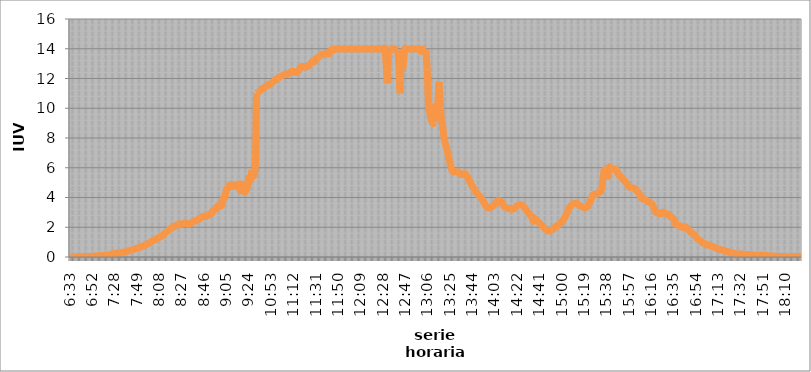
| Category | Series 0 |
|---|---|
| 0.27291666666666664 | 0.014 |
| 0.2736111111111111 | 0.014 |
| 0.2743055555555555 | 0.014 |
| 0.275 | 0.014 |
| 0.27569444444444446 | 0.014 |
| 0.27638888888888885 | 0.014 |
| 0.27708333333333335 | 0.014 |
| 0.2777777777777778 | 0.014 |
| 0.27847222222222223 | 0.014 |
| 0.2791666666666667 | 0.014 |
| 0.2798611111111111 | 0.014 |
| 0.28055555555555556 | 0.028 |
| 0.28125 | 0.028 |
| 0.28194444444444444 | 0.028 |
| 0.2826388888888889 | 0.028 |
| 0.2833333333333333 | 0.028 |
| 0.28402777777777777 | 0.028 |
| 0.2847222222222222 | 0.028 |
| 0.28541666666666665 | 0.028 |
| 0.28611111111111115 | 0.042 |
| 0.2923611111111111 | 0.056 |
| 0.29305555555555557 | 0.07 |
| 0.29375 | 0.07 |
| 0.29444444444444445 | 0.07 |
| 0.2951388888888889 | 0.07 |
| 0.29583333333333334 | 0.084 |
| 0.2972222222222222 | 0.084 |
| 0.29791666666666666 | 0.098 |
| 0.2986111111111111 | 0.098 |
| 0.29930555555555555 | 0.112 |
| 0.3 | 0.112 |
| 0.30069444444444443 | 0.112 |
| 0.3013888888888889 | 0.126 |
| 0.3020833333333333 | 0.126 |
| 0.30277777777777776 | 0.126 |
| 0.3090277777777778 | 0.21 |
| 0.30972222222222223 | 0.224 |
| 0.3104166666666667 | 0.224 |
| 0.3111111111111111 | 0.238 |
| 0.31180555555555556 | 0.252 |
| 0.3125 | 0.266 |
| 0.31319444444444444 | 0.266 |
| 0.3138888888888889 | 0.28 |
| 0.3145833333333333 | 0.294 |
| 0.31527777777777777 | 0.308 |
| 0.3159722222222222 | 0.322 |
| 0.31666666666666665 | 0.336 |
| 0.31736111111111115 | 0.35 |
| 0.31805555555555554 | 0.377 |
| 0.3201388888888889 | 0.419 |
| 0.32083333333333336 | 0.433 |
| 0.3215277777777778 | 0.447 |
| 0.32222222222222224 | 0.475 |
| 0.3229166666666667 | 0.503 |
| 0.3236111111111111 | 0.531 |
| 0.32430555555555557 | 0.559 |
| 0.325 | 0.587 |
| 0.32569444444444445 | 0.601 |
| 0.3263888888888889 | 0.629 |
| 0.32708333333333334 | 0.657 |
| 0.3277777777777778 | 0.685 |
| 0.3284722222222222 | 0.727 |
| 0.32916666666666666 | 0.755 |
| 0.3298611111111111 | 0.797 |
| 0.33055555555555555 | 0.825 |
| 0.33125 | 0.867 |
| 0.33194444444444443 | 0.909 |
| 0.3326388888888889 | 0.951 |
| 0.3333333333333333 | 0.993 |
| 0.3340277777777778 | 1.048 |
| 0.3347222222222222 | 1.09 |
| 0.3354166666666667 | 1.132 |
| 0.3361111111111111 | 1.174 |
| 0.3368055555555556 | 1.216 |
| 0.3375 | 1.258 |
| 0.33819444444444446 | 1.314 |
| 0.33888888888888885 | 1.356 |
| 0.33958333333333335 | 1.398 |
| 0.34027777777777773 | 1.44 |
| 0.34097222222222223 | 1.51 |
| 0.3416666666666666 | 1.594 |
| 0.3423611111111111 | 1.664 |
| 0.3430555555555555 | 1.734 |
| 0.34375 | 1.789 |
| 0.3444444444444445 | 1.859 |
| 0.3451388888888889 | 1.915 |
| 0.3458333333333334 | 1.957 |
| 0.34652777777777777 | 1.999 |
| 0.34722222222222227 | 2.027 |
| 0.34791666666666665 | 2.083 |
| 0.34861111111111115 | 2.139 |
| 0.34930555555555554 | 2.167 |
| 0.35 | 2.195 |
| 0.3506944444444444 | 2.237 |
| 0.3513888888888889 | 2.209 |
| 0.3520833333333333 | 2.209 |
| 0.3527777777777778 | 2.251 |
| 0.3534722222222222 | 2.293 |
| 0.3541666666666667 | 2.279 |
| 0.3548611111111111 | 2.223 |
| 0.35555555555555557 | 2.209 |
| 0.35625 | 2.223 |
| 0.35694444444444445 | 2.265 |
| 0.3576388888888889 | 2.335 |
| 0.35833333333333334 | 2.363 |
| 0.3590277777777778 | 2.405 |
| 0.3597222222222222 | 2.433 |
| 0.36041666666666666 | 2.433 |
| 0.3611111111111111 | 2.474 |
| 0.36180555555555555 | 2.572 |
| 0.3625 | 2.6 |
| 0.36319444444444443 | 2.67 |
| 0.3638888888888889 | 2.712 |
| 0.3645833333333333 | 2.754 |
| 0.3652777777777778 | 2.726 |
| 0.3659722222222222 | 2.726 |
| 0.3666666666666667 | 2.768 |
| 0.3673611111111111 | 2.824 |
| 0.3680555555555556 | 2.866 |
| 0.36875 | 2.894 |
| 0.36944444444444446 | 2.936 |
| 0.37013888888888885 | 3.118 |
| 0.37083333333333335 | 3.173 |
| 0.37152777777777773 | 3.215 |
| 0.37222222222222223 | 3.285 |
| 0.3729166666666666 | 3.425 |
| 0.3736111111111111 | 3.481 |
| 0.3743055555555555 | 3.411 |
| 0.375 | 3.453 |
| 0.3756944444444445 | 3.635 |
| 0.3763888888888889 | 3.97 |
| 0.3770833333333334 | 3.956 |
| 0.37777777777777777 | 4.404 |
| 0.37847222222222227 | 4.613 |
| 0.37916666666666665 | 4.641 |
| 0.37986111111111115 | 4.795 |
| 0.38055555555555554 | 4.865 |
| 0.38125 | 4.879 |
| 0.3819444444444444 | 4.795 |
| 0.3826388888888889 | 4.767 |
| 0.3833333333333333 | 4.851 |
| 0.3840277777777778 | 4.767 |
| 0.3847222222222222 | 4.851 |
| 0.3854166666666667 | 4.879 |
| 0.3861111111111111 | 4.474 |
| 0.38680555555555557 | 4.907 |
| 0.3875 | 4.544 |
| 0.38819444444444445 | 4.404 |
| 0.3888888888888889 | 4.362 |
| 0.38958333333333334 | 4.474 |
| 0.3902777777777778 | 4.627 |
| 0.3909722222222222 | 5.201 |
| 0.39166666666666666 | 5.326 |
| 0.3923611111111111 | 5.019 |
| 0.39305555555555555 | 5.858 |
| 0.39375 | 5.83 |
| 0.39444444444444443 | 5.48 |
| 0.3951388888888889 | 5.942 |
| 0.4444444444444444 | 11.002 |
| 0.4451388888888889 | 11.058 |
| 0.4458333333333333 | 11.1 |
| 0.4465277777777778 | 11.184 |
| 0.4472222222222222 | 11.268 |
| 0.4479166666666667 | 11.338 |
| 0.4486111111111111 | 11.366 |
| 0.44930555555555557 | 11.394 |
| 0.45 | 11.492 |
| 0.45069444444444445 | 11.52 |
| 0.4513888888888889 | 11.547 |
| 0.45208333333333334 | 11.617 |
| 0.4527777777777778 | 11.659 |
| 0.4534722222222222 | 11.701 |
| 0.45416666666666666 | 11.785 |
| 0.4548611111111111 | 11.841 |
| 0.45555555555555555 | 11.897 |
| 0.45625 | 11.953 |
| 0.45694444444444443 | 12.009 |
| 0.4576388888888889 | 12.079 |
| 0.4583333333333333 | 12.135 |
| 0.4590277777777778 | 12.163 |
| 0.4597222222222222 | 12.191 |
| 0.4604166666666667 | 12.233 |
| 0.4611111111111111 | 12.288 |
| 0.4618055555555556 | 12.288 |
| 0.4625 | 12.274 |
| 0.46319444444444446 | 12.33 |
| 0.46388888888888885 | 12.386 |
| 0.46458333333333335 | 12.442 |
| 0.46527777777777773 | 12.484 |
| 0.46597222222222223 | 12.47 |
| 0.4666666666666666 | 12.47 |
| 0.4673611111111111 | 12.428 |
| 0.4680555555555555 | 12.4 |
| 0.46875 | 12.456 |
| 0.4694444444444445 | 12.554 |
| 0.4701388888888889 | 12.708 |
| 0.4708333333333334 | 12.792 |
| 0.47152777777777777 | 12.82 |
| 0.47222222222222227 | 12.806 |
| 0.47291666666666665 | 12.778 |
| 0.47361111111111115 | 12.764 |
| 0.47430555555555554 | 12.806 |
| 0.475 | 12.848 |
| 0.4756944444444444 | 12.904 |
| 0.4763888888888889 | 13.015 |
| 0.4770833333333333 | 13.113 |
| 0.4777777777777778 | 13.155 |
| 0.4784722222222222 | 13.127 |
| 0.4791666666666667 | 13.197 |
| 0.4798611111111111 | 13.337 |
| 0.48055555555555557 | 13.407 |
| 0.48125 | 13.463 |
| 0.48194444444444445 | 13.519 |
| 0.4826388888888889 | 13.589 |
| 0.48333333333333334 | 13.63 |
| 0.4840277777777778 | 13.658 |
| 0.4847222222222222 | 13.644 |
| 0.48541666666666666 | 13.672 |
| 0.4861111111111111 | 13.686 |
| 0.48680555555555555 | 13.644 |
| 0.4875 | 13.686 |
| 0.48819444444444443 | 13.882 |
| 0.4888888888888889 | 13.952 |
| 0.4895833333333333 | 13.924 |
| 0.4902777777777778 | 13.938 |
| 0.4909722222222222 | 13.98 |
| 0.4916666666666667 | 13.98 |
| 0.4923611111111111 | 13.98 |
| 0.4930555555555556 | 13.98 |
| 0.49375 | 13.98 |
| 0.49444444444444446 | 13.98 |
| 0.49513888888888885 | 13.98 |
| 0.49583333333333335 | 13.98 |
| 0.49652777777777773 | 13.98 |
| 0.49722222222222223 | 13.98 |
| 0.4979166666666666 | 13.98 |
| 0.4986111111111111 | 13.98 |
| 0.4993055555555555 | 13.98 |
| 0.5 | 13.98 |
| 0.5006944444444444 | 13.98 |
| 0.5013888888888889 | 13.98 |
| 0.5020833333333333 | 13.98 |
| 0.5027777777777778 | 13.98 |
| 0.5034722222222222 | 13.98 |
| 0.5041666666666667 | 13.98 |
| 0.5048611111111111 | 13.98 |
| 0.5055555555555555 | 13.98 |
| 0.50625 | 13.98 |
| 0.5069444444444444 | 13.98 |
| 0.5076388888888889 | 13.98 |
| 0.5083333333333333 | 13.98 |
| 0.5090277777777777 | 13.98 |
| 0.5097222222222222 | 13.98 |
| 0.5104166666666666 | 13.98 |
| 0.5111111111111112 | 13.98 |
| 0.5118055555555555 | 13.98 |
| 0.5125 | 13.98 |
| 0.5131944444444444 | 13.98 |
| 0.513888888888889 | 13.98 |
| 0.5145833333333333 | 13.98 |
| 0.5152777777777778 | 13.98 |
| 0.5159722222222222 | 13.98 |
| 0.5166666666666667 | 13.98 |
| 0.517361111111111 | 13.98 |
| 0.5180555555555556 | 13.98 |
| 0.51875 | 13.98 |
| 0.5194444444444445 | 13.98 |
| 0.5201388888888888 | 13.98 |
| 0.5208333333333334 | 13.127 |
| 0.5215277777777778 | 11.673 |
| 0.5222222222222223 | 13.98 |
| 0.5229166666666667 | 13.98 |
| 0.5236111111111111 | 13.98 |
| 0.5243055555555556 | 13.98 |
| 0.525 | 13.98 |
| 0.5256944444444445 | 13.98 |
| 0.5263888888888889 | 13.98 |
| 0.5270833333333333 | 13.98 |
| 0.5277777777777778 | 13.98 |
| 0.5284722222222222 | 12.82 |
| 0.5291666666666667 | 11.002 |
| 0.5298611111111111 | 13.812 |
| 0.5305555555555556 | 12.568 |
| 0.53125 | 13.211 |
| 0.5319444444444444 | 13.98 |
| 0.5326388888888889 | 13.98 |
| 0.5333333333333333 | 13.98 |
| 0.5340277777777778 | 13.98 |
| 0.5347222222222222 | 13.98 |
| 0.5354166666666667 | 13.98 |
| 0.5361111111111111 | 13.98 |
| 0.5368055555555555 | 13.98 |
| 0.5375 | 13.98 |
| 0.5381944444444444 | 13.98 |
| 0.5388888888888889 | 13.98 |
| 0.5395833333333333 | 13.98 |
| 0.5402777777777777 | 13.98 |
| 0.5409722222222222 | 13.98 |
| 0.5416666666666666 | 13.826 |
| 0.5423611111111112 | 13.84 |
| 0.5430555555555555 | 13.98 |
| 0.54375 | 13.98 |
| 0.5444444444444444 | 13.98 |
| 0.545138888888889 | 12.61 |
| 0.5458333333333333 | 10.359 |
| 0.5465277777777778 | 9.758 |
| 0.5472222222222222 | 9.367 |
| 0.5479166666666667 | 9.129 |
| 0.548611111111111 | 8.961 |
| 0.5493055555555556 | 9.059 |
| 0.55 | 10.317 |
| 0.5506944444444445 | 9.968 |
| 0.5513888888888888 | 10.275 |
| 0.5520833333333334 | 11.771 |
| 0.5527777777777778 | 10.555 |
| 0.5534722222222223 | 9.311 |
| 0.5541666666666667 | 8.961 |
| 0.5548611111111111 | 8.192 |
| 0.5555555555555556 | 7.773 |
| 0.55625 | 7.465 |
| 0.5569444444444445 | 7.158 |
| 0.5576388888888889 | 6.78 |
| 0.5583333333333333 | 6.459 |
| 0.5590277777777778 | 6.109 |
| 0.5597222222222222 | 5.83 |
| 0.5604166666666667 | 5.718 |
| 0.5611111111111111 | 5.718 |
| 0.5618055555555556 | 5.746 |
| 0.5625 | 5.746 |
| 0.5631944444444444 | 5.718 |
| 0.5638888888888889 | 5.648 |
| 0.5645833333333333 | 5.592 |
| 0.5652777777777778 | 5.55 |
| 0.5659722222222222 | 5.55 |
| 0.5666666666666667 | 5.592 |
| 0.5673611111111111 | 5.606 |
| 0.5680555555555555 | 5.536 |
| 0.56875 | 5.41 |
| 0.5694444444444444 | 5.27 |
| 0.5701388888888889 | 5.131 |
| 0.5708333333333333 | 4.977 |
| 0.5715277777777777 | 4.823 |
| 0.5722222222222222 | 4.683 |
| 0.5729166666666666 | 4.544 |
| 0.5736111111111112 | 4.418 |
| 0.5743055555555555 | 4.32 |
| 0.575 | 4.222 |
| 0.5756944444444444 | 4.124 |
| 0.576388888888889 | 4.04 |
| 0.5770833333333333 | 3.956 |
| 0.5777777777777778 | 3.845 |
| 0.5784722222222222 | 3.705 |
| 0.5791666666666667 | 3.551 |
| 0.579861111111111 | 3.425 |
| 0.5805555555555556 | 3.341 |
| 0.58125 | 3.299 |
| 0.5819444444444445 | 3.299 |
| 0.5826388888888888 | 3.341 |
| 0.5833333333333334 | 3.383 |
| 0.5840277777777778 | 3.439 |
| 0.5847222222222223 | 3.523 |
| 0.5854166666666667 | 3.607 |
| 0.5861111111111111 | 3.705 |
| 0.5868055555555556 | 3.775 |
| 0.5875 | 3.789 |
| 0.5881944444444445 | 3.775 |
| 0.5888888888888889 | 3.691 |
| 0.5895833333333333 | 3.593 |
| 0.5902777777777778 | 3.467 |
| 0.5909722222222222 | 3.369 |
| 0.5916666666666667 | 3.313 |
| 0.5923611111111111 | 3.285 |
| 0.5930555555555556 | 3.257 |
| 0.59375 | 3.243 |
| 0.5944444444444444 | 3.215 |
| 0.5951388888888889 | 3.201 |
| 0.5958333333333333 | 3.215 |
| 0.5965277777777778 | 3.271 |
| 0.5972222222222222 | 3.341 |
| 0.5979166666666667 | 3.411 |
| 0.5986111111111111 | 3.467 |
| 0.5993055555555555 | 3.509 |
| 0.6 | 3.523 |
| 0.6006944444444444 | 3.509 |
| 0.6013888888888889 | 3.467 |
| 0.6020833333333333 | 3.397 |
| 0.6027777777777777 | 3.299 |
| 0.6034722222222222 | 3.187 |
| 0.6041666666666666 | 3.062 |
| 0.6048611111111112 | 2.964 |
| 0.6055555555555555 | 2.866 |
| 0.60625 | 2.782 |
| 0.6069444444444444 | 2.712 |
| 0.607638888888889 | 2.405 |
| 0.6083333333333333 | 2.6 |
| 0.6090277777777778 | 2.53 |
| 0.6097222222222222 | 2.46 |
| 0.6104166666666667 | 2.391 |
| 0.611111111111111 | 2.307 |
| 0.6118055555555556 | 2.237 |
| 0.6125 | 2.167 |
| 0.6131944444444445 | 2.083 |
| 0.6138888888888888 | 1.999 |
| 0.6145833333333334 | 1.915 |
| 0.6152777777777778 | 1.831 |
| 0.6159722222222223 | 1.775 |
| 0.6166666666666667 | 1.748 |
| 0.6173611111111111 | 1.748 |
| 0.6180555555555556 | 1.775 |
| 0.61875 | 1.831 |
| 0.6194444444444445 | 1.887 |
| 0.6201388888888889 | 1.957 |
| 0.6208333333333333 | 2.027 |
| 0.6215277777777778 | 2.083 |
| 0.6222222222222222 | 2.139 |
| 0.6229166666666667 | 2.195 |
| 0.6236111111111111 | 2.265 |
| 0.6243055555555556 | 2.335 |
| 0.625 | 2.419 |
| 0.6256944444444444 | 2.53 |
| 0.6263888888888889 | 2.67 |
| 0.6270833333333333 | 2.838 |
| 0.6277777777777778 | 3.02 |
| 0.6284722222222222 | 3.187 |
| 0.6291666666666667 | 3.327 |
| 0.6298611111111111 | 3.439 |
| 0.6305555555555555 | 3.509 |
| 0.63125 | 3.565 |
| 0.6319444444444444 | 3.607 |
| 0.6326388888888889 | 3.621 |
| 0.6333333333333333 | 3.607 |
| 0.6340277777777777 | 3.551 |
| 0.6347222222222222 | 3.495 |
| 0.6354166666666666 | 3.439 |
| 0.6361111111111112 | 3.397 |
| 0.6368055555555555 | 3.369 |
| 0.6375 | 3.341 |
| 0.6381944444444444 | 3.313 |
| 0.638888888888889 | 3.327 |
| 0.6395833333333333 | 3.383 |
| 0.6402777777777778 | 3.467 |
| 0.6409722222222222 | 3.635 |
| 0.6416666666666667 | 3.831 |
| 0.642361111111111 | 4.04 |
| 0.6430555555555556 | 4.166 |
| 0.64375 | 4.222 |
| 0.6444444444444445 | 4.208 |
| 0.6451388888888888 | 4.208 |
| 0.6458333333333334 | 4.264 |
| 0.6465277777777778 | 4.348 |
| 0.6472222222222223 | 4.418 |
| 0.6479166666666667 | 4.474 |
| 0.6486111111111111 | 5.005 |
| 0.6493055555555556 | 5.69 |
| 0.65 | 5.872 |
| 0.6506944444444445 | 5.76 |
| 0.6513888888888889 | 5.215 |
| 0.6520833333333333 | 5.886 |
| 0.6527777777777778 | 6.067 |
| 0.6534722222222222 | 5.928 |
| 0.6541666666666667 | 5.9 |
| 0.6548611111111111 | 5.886 |
| 0.6555555555555556 | 5.886 |
| 0.65625 | 5.9 |
| 0.6569444444444444 | 5.816 |
| 0.6576388888888889 | 5.648 |
| 0.6583333333333333 | 5.522 |
| 0.6590277777777778 | 5.438 |
| 0.6597222222222222 | 5.368 |
| 0.6604166666666667 | 5.284 |
| 0.6611111111111111 | 5.187 |
| 0.6618055555555555 | 5.089 |
| 0.6625 | 5.005 |
| 0.6631944444444444 | 4.893 |
| 0.6638888888888889 | 4.781 |
| 0.6645833333333333 | 4.697 |
| 0.6652777777777777 | 4.655 |
| 0.6659722222222222 | 4.641 |
| 0.6666666666666666 | 4.641 |
| 0.6673611111111111 | 4.613 |
| 0.6680555555555556 | 4.544 |
| 0.66875 | 4.474 |
| 0.6694444444444444 | 4.39 |
| 0.6701388888888888 | 4.278 |
| 0.6708333333333334 | 4.11 |
| 0.6715277777777778 | 3.956 |
| 0.6722222222222222 | 3.942 |
| 0.6729166666666666 | 3.872 |
| 0.6736111111111112 | 3.858 |
| 0.6743055555555556 | 3.831 |
| 0.675 | 3.775 |
| 0.6756944444444444 | 3.719 |
| 0.6763888888888889 | 3.677 |
| 0.6770833333333334 | 3.621 |
| 0.6777777777777777 | 3.565 |
| 0.6784722222222223 | 3.397 |
| 0.6791666666666667 | 3.215 |
| 0.6798611111111111 | 3.048 |
| 0.6805555555555555 | 2.978 |
| 0.68125 | 2.978 |
| 0.6819444444444445 | 2.908 |
| 0.6826388888888889 | 2.894 |
| 0.6833333333333332 | 2.922 |
| 0.6840277777777778 | 3.02 |
| 0.6847222222222222 | 2.964 |
| 0.6854166666666667 | 2.95 |
| 0.686111111111111 | 2.922 |
| 0.6868055555555556 | 2.894 |
| 0.6875 | 2.824 |
| 0.6881944444444444 | 2.782 |
| 0.688888888888889 | 2.712 |
| 0.6895833333333333 | 2.642 |
| 0.6902777777777778 | 2.586 |
| 0.6909722222222222 | 2.474 |
| 0.6916666666666668 | 2.237 |
| 0.6923611111111111 | 2.181 |
| 0.6930555555555555 | 2.153 |
| 0.69375 | 2.139 |
| 0.6944444444444445 | 2.069 |
| 0.6951388888888889 | 2.027 |
| 0.6958333333333333 | 1.985 |
| 0.6965277777777777 | 1.985 |
| 0.6972222222222223 | 2.041 |
| 0.6979166666666666 | 1.999 |
| 0.6986111111111111 | 1.929 |
| 0.6993055555555556 | 1.845 |
| 0.7 | 1.761 |
| 0.7006944444444444 | 1.664 |
| 0.7013888888888888 | 1.608 |
| 0.7020833333333334 | 1.552 |
| 0.7027777777777778 | 1.496 |
| 0.7034722222222222 | 1.412 |
| 0.7041666666666666 | 1.272 |
| 0.7048611111111112 | 1.202 |
| 0.7055555555555556 | 1.146 |
| 0.70625 | 1.09 |
| 0.7069444444444444 | 1.021 |
| 0.7076388888888889 | 0.965 |
| 0.7083333333333334 | 0.923 |
| 0.7090277777777777 | 0.895 |
| 0.7097222222222223 | 0.853 |
| 0.7104166666666667 | 0.825 |
| 0.7111111111111111 | 0.797 |
| 0.7118055555555555 | 0.769 |
| 0.7125 | 0.741 |
| 0.7131944444444445 | 0.713 |
| 0.7138888888888889 | 0.685 |
| 0.7145833333333332 | 0.657 |
| 0.7152777777777778 | 0.629 |
| 0.7159722222222222 | 0.587 |
| 0.7166666666666667 | 0.559 |
| 0.717361111111111 | 0.531 |
| 0.7180555555555556 | 0.503 |
| 0.71875 | 0.475 |
| 0.7194444444444444 | 0.461 |
| 0.720138888888889 | 0.433 |
| 0.7208333333333333 | 0.405 |
| 0.7215277777777778 | 0.391 |
| 0.7222222222222222 | 0.363 |
| 0.7229166666666668 | 0.336 |
| 0.7236111111111111 | 0.308 |
| 0.7243055555555555 | 0.294 |
| 0.725 | 0.266 |
| 0.7256944444444445 | 0.252 |
| 0.7263888888888889 | 0.238 |
| 0.7270833333333333 | 0.224 |
| 0.7277777777777777 | 0.224 |
| 0.7284722222222223 | 0.21 |
| 0.7291666666666666 | 0.196 |
| 0.7298611111111111 | 0.196 |
| 0.7305555555555556 | 0.182 |
| 0.73125 | 0.182 |
| 0.7319444444444444 | 0.182 |
| 0.7326388888888888 | 0.182 |
| 0.7333333333333334 | 0.168 |
| 0.7340277777777778 | 0.168 |
| 0.7347222222222222 | 0.168 |
| 0.7354166666666666 | 0.154 |
| 0.7361111111111112 | 0.154 |
| 0.7368055555555556 | 0.154 |
| 0.7375 | 0.14 |
| 0.7381944444444444 | 0.14 |
| 0.7388888888888889 | 0.126 |
| 0.7395833333333334 | 0.126 |
| 0.7402777777777777 | 0.126 |
| 0.7409722222222223 | 0.126 |
| 0.7416666666666667 | 0.126 |
| 0.7423611111111111 | 0.126 |
| 0.7430555555555555 | 0.112 |
| 0.74375 | 0.112 |
| 0.7444444444444445 | 0.112 |
| 0.7451388888888889 | 0.098 |
| 0.7458333333333332 | 0.098 |
| 0.7465277777777778 | 0.084 |
| 0.7472222222222222 | 0.084 |
| 0.7479166666666667 | 0.07 |
| 0.748611111111111 | 0.07 |
| 0.7493055555555556 | 0.056 |
| 0.75 | 0.056 |
| 0.7506944444444444 | 0.056 |
| 0.751388888888889 | 0.042 |
| 0.7520833333333333 | 0.042 |
| 0.7527777777777778 | 0.042 |
| 0.7534722222222222 | 0.042 |
| 0.7541666666666668 | 0.028 |
| 0.7548611111111111 | 0.028 |
| 0.7555555555555555 | 0.028 |
| 0.75625 | 0.028 |
| 0.7569444444444445 | 0.028 |
| 0.7576388888888889 | 0.028 |
| 0.7583333333333333 | 0.014 |
| 0.7590277777777777 | 0.014 |
| 0.7597222222222223 | 0.014 |
| 0.7604166666666666 | 0.014 |
| 0.7611111111111111 | 0.014 |
| 0.7618055555555556 | 0.014 |
| 0.7625 | 0.014 |
| 0.7631944444444444 | 0.014 |
| 0.7638888888888888 | 0.014 |
| 0.7645833333333334 | 0.014 |
| 0.7652777777777778 | 0.014 |
| 0.7659722222222222 | 0.014 |